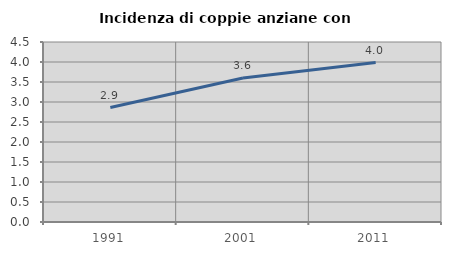
| Category | Incidenza di coppie anziane con figli |
|---|---|
| 1991.0 | 2.861 |
| 2001.0 | 3.598 |
| 2011.0 | 3.987 |